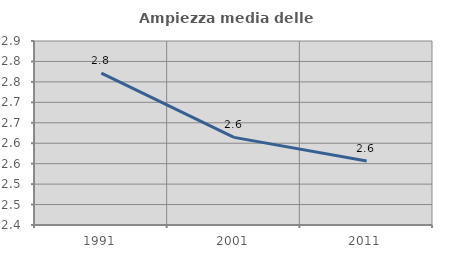
| Category | Ampiezza media delle famiglie |
|---|---|
| 1991.0 | 2.772 |
| 2001.0 | 2.614 |
| 2011.0 | 2.557 |